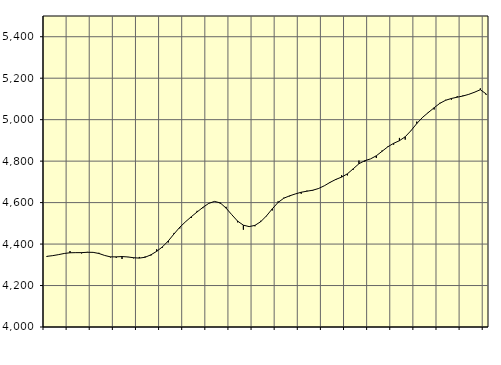
| Category | Piggar | Series 1 |
|---|---|---|
| nan | 4337.9 | 4340.74 |
| 1.0 | 4343.6 | 4344.11 |
| 1.0 | 4349.6 | 4349 |
| 1.0 | 4354.4 | 4354.65 |
| nan | 4366.4 | 4358 |
| 2.0 | 4358 | 4358.6 |
| 2.0 | 4354.8 | 4358.67 |
| 2.0 | 4362.2 | 4360.32 |
| nan | 4359.4 | 4360.01 |
| 3.0 | 4357.8 | 4354.58 |
| 3.0 | 4345.4 | 4345.06 |
| 3.0 | 4335.6 | 4338.28 |
| nan | 4333.7 | 4338.36 |
| 4.0 | 4327.9 | 4339.74 |
| 4.0 | 4337 | 4337.87 |
| 4.0 | 4331.2 | 4334.15 |
| nan | 4337.8 | 4332.28 |
| 5.0 | 4340.1 | 4336.36 |
| 5.0 | 4344.5 | 4348.13 |
| 5.0 | 4375 | 4365.01 |
| nan | 4383 | 4386.64 |
| 6.0 | 4407.7 | 4414.95 |
| 6.0 | 4453.6 | 4448.91 |
| 6.0 | 4475.5 | 4481.27 |
| nan | 4507.2 | 4507.86 |
| 7.0 | 4525.8 | 4532.16 |
| 7.0 | 4560.2 | 4554.89 |
| 7.0 | 4573.2 | 4577.01 |
| nan | 4595.2 | 4596.1 |
| 8.0 | 4606.1 | 4605.71 |
| 8.0 | 4594.6 | 4598.62 |
| 8.0 | 4579.6 | 4573.55 |
| nan | 4541.3 | 4541.46 |
| 9.0 | 4504.9 | 4510.66 |
| 9.0 | 4469.2 | 4491.08 |
| 9.0 | 4485.2 | 4484.22 |
| nan | 4485.8 | 4490.16 |
| 10.0 | 4512.2 | 4507.99 |
| 10.0 | 4534.5 | 4536.05 |
| 10.0 | 4562.1 | 4569.92 |
| nan | 4605.9 | 4600.67 |
| 11.0 | 4623.7 | 4621.21 |
| 11.0 | 4630.2 | 4632.61 |
| 11.0 | 4642.1 | 4641.84 |
| nan | 4642.5 | 4649.99 |
| 12.0 | 4657.7 | 4655 |
| 12.0 | 4657.3 | 4659.69 |
| 12.0 | 4669 | 4667.92 |
| nan | 4680.9 | 4681.06 |
| 13.0 | 4696 | 4697.55 |
| 13.0 | 4708.9 | 4711.82 |
| 13.0 | 4731.9 | 4722.99 |
| nan | 4731.1 | 4738.92 |
| 14.0 | 4758.5 | 4763.01 |
| 14.0 | 4802.8 | 4787.51 |
| 14.0 | 4797 | 4802.02 |
| nan | 4810.7 | 4810.75 |
| 15.0 | 4815 | 4825.81 |
| 15.0 | 4851.3 | 4847.58 |
| 15.0 | 4871.2 | 4869.24 |
| nan | 4879.4 | 4886.01 |
| 16.0 | 4911.9 | 4898.47 |
| 16.0 | 4903.7 | 4917.5 |
| 16.0 | 4945.8 | 4946.9 |
| nan | 4990.5 | 4981.13 |
| 17.0 | 5009.5 | 5011.01 |
| 17.0 | 5037.2 | 5034.42 |
| 17.0 | 5049 | 5057.39 |
| nan | 5081.2 | 5078.92 |
| 18.0 | 5095.7 | 5093.56 |
| 18.0 | 5096.4 | 5102.27 |
| 18.0 | 5113.1 | 5108.27 |
| nan | 5116.6 | 5114.15 |
| 19.0 | 5121.6 | 5122.11 |
| 19.0 | 5133.5 | 5132.4 |
| 19.0 | 5150.9 | 5144.47 |
| nan | 5119.9 | 5124.32 |